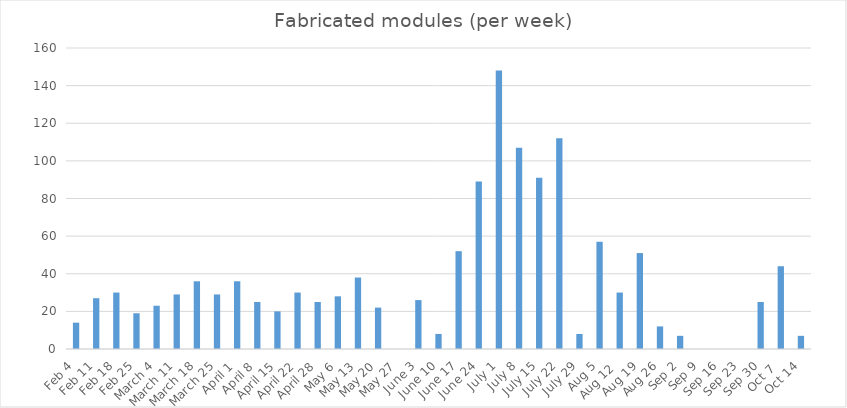
| Category | Series 0 |
|---|---|
| Feb 4 | 14 |
| Feb 11 | 27 |
| Feb 18 | 30 |
| Feb 25 | 19 |
| March 4 | 23 |
| March 11 | 29 |
| March 18 | 36 |
| March 25 | 29 |
| April 1 | 36 |
| April 8 | 25 |
| April 15 | 20 |
| April 22 | 30 |
| April 28 | 25 |
| May 6 | 28 |
| May 13 | 38 |
| May 20 | 22 |
| May 27 | 0 |
| June 3 | 26 |
| June 10 | 8 |
| June 17 | 52 |
| June 24 | 89 |
| July 1 | 148 |
| July 8 | 107 |
| July 15 | 91 |
| July 22 | 112 |
| July 29 | 8 |
| Aug 5 | 57 |
| Aug 12  | 30 |
| Aug 19 | 51 |
| Aug 26 | 12 |
| Sep 2 | 7 |
| Sep 9 | 0 |
| Sep 16 | 0 |
| Sep 23 | 0 |
| Sep 30 | 25 |
| Oct 7  | 44 |
| Oct 14 | 7 |